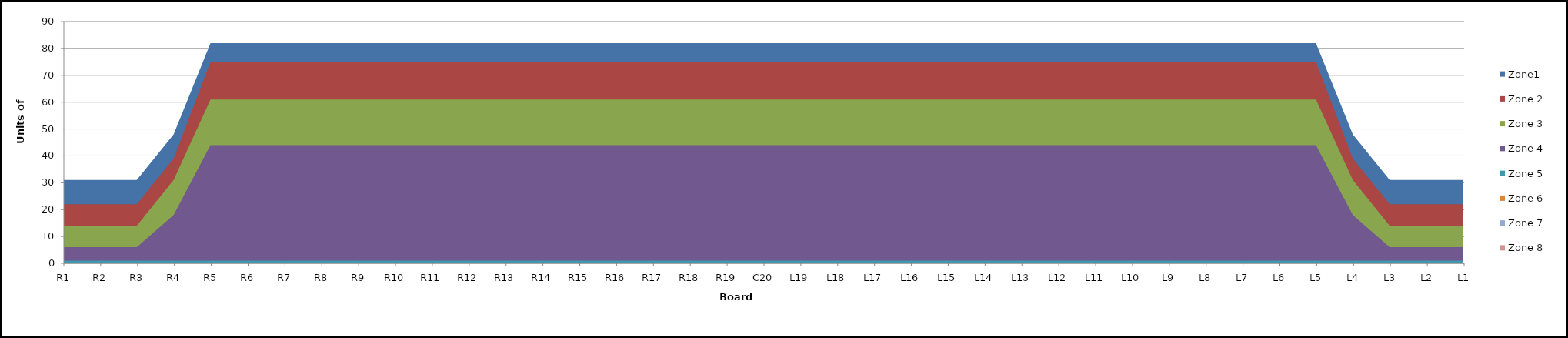
| Category | Zone1 | Zone 2 | Zone 3 | Zone 4 | Zone 5 | Zone 6 | Zone 7 | Zone 8 |
|---|---|---|---|---|---|---|---|---|
| L1 | 31 | 22 | 14 | 6 | 1 |  |  |  |
| L2 | 31 | 22 | 14 | 6 | 1 |  |  |  |
| L3 | 31 | 22 | 14 | 6 | 1 |  |  |  |
| L4 | 48 | 39 | 31 | 18 | 1 |  |  |  |
| L5 | 82 | 75 | 61 | 44 | 1 |  |  |  |
| L6 | 82 | 75 | 61 | 44 | 1 |  |  |  |
| L7 | 82 | 75 | 61 | 44 | 1 |  |  |  |
| L8 | 82 | 75 | 61 | 44 | 1 |  |  |  |
| L9 | 82 | 75 | 61 | 44 | 1 |  |  |  |
| L10 | 82 | 75 | 61 | 44 | 1 |  |  |  |
| L11 | 82 | 75 | 61 | 44 | 1 |  |  |  |
| L12 | 82 | 75 | 61 | 44 | 1 |  |  |  |
| L13 | 82 | 75 | 61 | 44 | 1 |  |  |  |
| L14 | 82 | 75 | 61 | 44 | 1 |  |  |  |
| L15 | 82 | 75 | 61 | 44 | 1 |  |  |  |
| L16 | 82 | 75 | 61 | 44 | 1 |  |  |  |
| L17 | 82 | 75 | 61 | 44 | 1 |  |  |  |
| L18 | 82 | 75 | 61 | 44 | 1 |  |  |  |
| L19 | 82 | 75 | 61 | 44 | 1 |  |  |  |
| C20 | 82 | 75 | 61 | 44 | 1 |  |  |  |
| R19 | 82 | 75 | 61 | 44 | 1 |  |  |  |
| R18 | 82 | 75 | 61 | 44 | 1 |  |  |  |
| R17 | 82 | 75 | 61 | 44 | 1 |  |  |  |
| R16 | 82 | 75 | 61 | 44 | 1 |  |  |  |
| R15 | 82 | 75 | 61 | 44 | 1 |  |  |  |
| R14 | 82 | 75 | 61 | 44 | 1 |  |  |  |
| R13 | 82 | 75 | 61 | 44 | 1 |  |  |  |
| R12 | 82 | 75 | 61 | 44 | 1 |  |  |  |
| R11 | 82 | 75 | 61 | 44 | 1 |  |  |  |
| R10 | 82 | 75 | 61 | 44 | 1 |  |  |  |
| R9 | 82 | 75 | 61 | 44 | 1 |  |  |  |
| R8 | 82 | 75 | 61 | 44 | 1 |  |  |  |
| R7 | 82 | 75 | 61 | 44 | 1 |  |  |  |
| R6 | 82 | 75 | 61 | 44 | 1 |  |  |  |
| R5 | 82 | 75 | 61 | 44 | 1 |  |  |  |
| R4 | 48 | 39 | 31 | 18 | 1 |  |  |  |
| R3 | 31 | 22 | 14 | 6 | 1 |  |  |  |
| R2 | 31 | 22 | 14 | 6 | 1 |  |  |  |
| R1 | 31 | 22 | 14 | 6 | 1 |  |  |  |